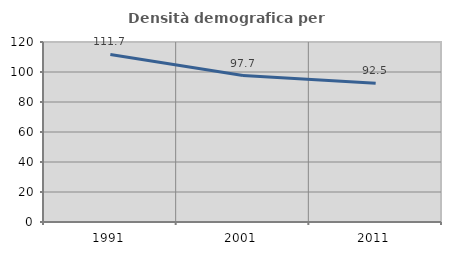
| Category | Densità demografica |
|---|---|
| 1991.0 | 111.672 |
| 2001.0 | 97.652 |
| 2011.0 | 92.471 |